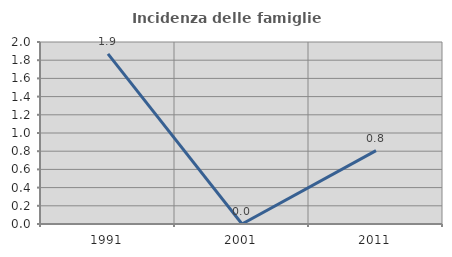
| Category | Incidenza delle famiglie numerose |
|---|---|
| 1991.0 | 1.869 |
| 2001.0 | 0 |
| 2011.0 | 0.806 |